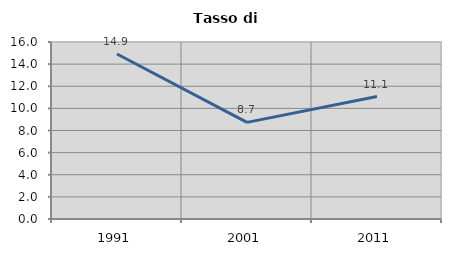
| Category | Tasso di disoccupazione   |
|---|---|
| 1991.0 | 14.912 |
| 2001.0 | 8.734 |
| 2011.0 | 11.066 |